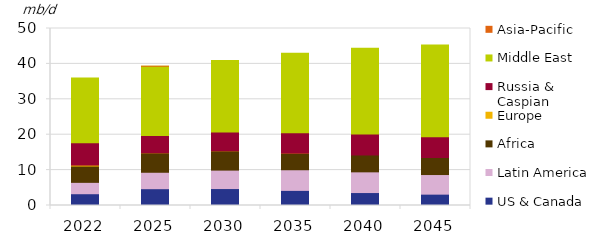
| Category | US & Canada | Latin America | Africa | Europe | Russia & Caspian | Middle East | Asia-Pacific |
|---|---|---|---|---|---|---|---|
| 2022.0 | 3.326 | 3.211 | 4.601 | 0.283 | 6.286 | 18.318 | 0 |
| 2025.0 | 4.745 | 4.643 | 5.489 | 0.004 | 4.861 | 19.599 | 0 |
| 2030.0 | 4.785 | 5.215 | 5.447 | 0 | 5.319 | 20.199 | 0 |
| 2035.0 | 4.267 | 5.834 | 4.676 | 0 | 5.798 | 22.418 | 0 |
| 2040.0 | 3.658 | 5.85 | 4.764 | 0 | 5.937 | 24.191 | 0 |
| 2045.0 | 3.205 | 5.542 | 4.804 | 0.001 | 5.869 | 25.908 | 0 |